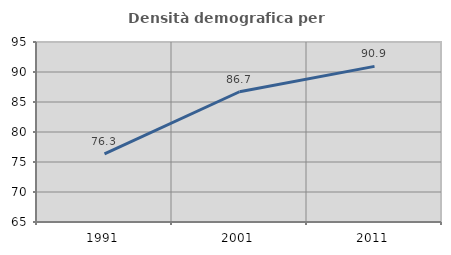
| Category | Densità demografica |
|---|---|
| 1991.0 | 76.348 |
| 2001.0 | 86.709 |
| 2011.0 | 90.941 |